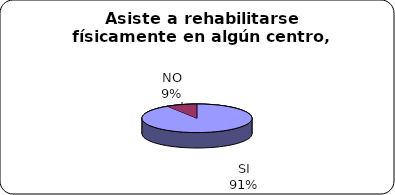
| Category | Series 0 |
|---|---|
| SI | 0.91 |
| NO | 0.09 |